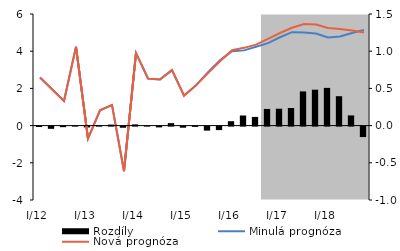
| Category | Rozdíly |
|---|---|
| I/12 | -0.006 |
| II | -0.03 |
| III | -0.008 |
| IV | 0.001 |
| I/13 | -0.011 |
| II | 0.004 |
| III | 0.014 |
| IV | -0.015 |
| I/14 | 0.016 |
| II | 0.001 |
| III | -0.011 |
| IV | 0.033 |
| I/15 | -0.015 |
| II | -0.004 |
| III | -0.054 |
| IV | -0.047 |
| I/16 | 0.059 |
| II | 0.136 |
| III | 0.117 |
| IV | 0.224 |
| I/17 | 0.227 |
| II | 0.237 |
| III | 0.46 |
| IV | 0.482 |
| I/18 | 0.507 |
| II | 0.395 |
| III | 0.137 |
| IV | -0.141 |